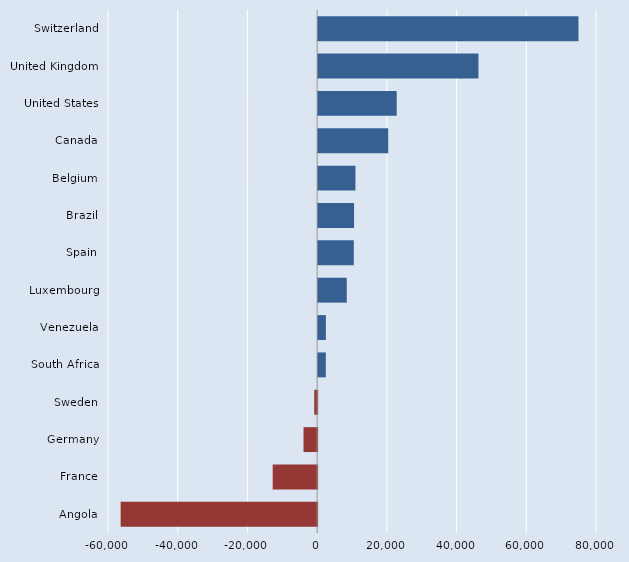
| Category | Series 0 |
|---|---|
| Switzerland | 74682 |
| United Kingdom | 45993 |
| United States | 22540 |
| Canada | 20098 |
| Belgium | 10695 |
| Brazil | 10306 |
| Spain | 10233 |
| Luxembourg | 8213 |
| Venezuela | 2216 |
| South Africa | 2202 |
| Sweden | -835 |
| Germany | -3907 |
| France | -12752 |
| Angola | -56368 |